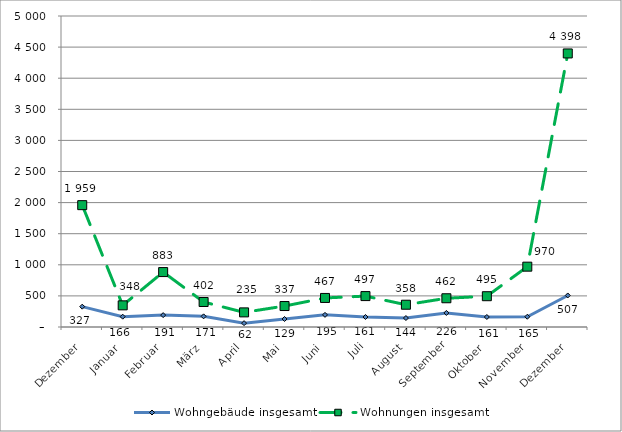
| Category | Wohngebäude insgesamt | Wohnungen insgesamt |
|---|---|---|
| Dezember | 327 | 1959 |
| Januar | 166 | 348 |
| Februar | 191 | 883 |
| März | 171 | 402 |
| April | 62 | 235 |
| Mai | 129 | 337 |
| Juni | 195 | 467 |
| Juli | 161 | 497 |
| August | 144 | 358 |
| September | 226 | 462 |
| Oktober | 161 | 495 |
| November | 165 | 970 |
| Dezember | 507 | 4398 |